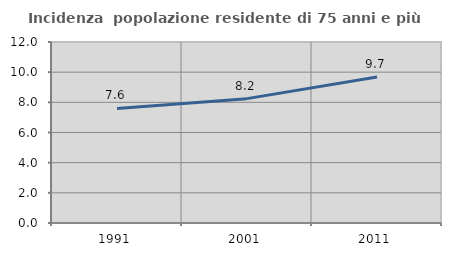
| Category | Incidenza  popolazione residente di 75 anni e più |
|---|---|
| 1991.0 | 7.598 |
| 2001.0 | 8.245 |
| 2011.0 | 9.673 |